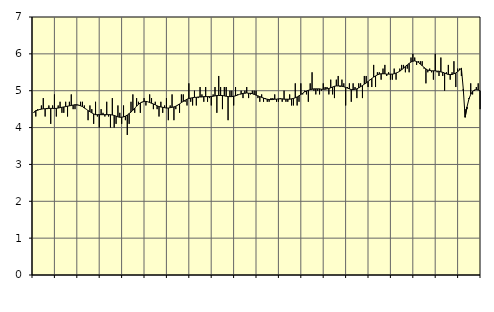
| Category | Piggar | Personliga och kulturella tjänster, SNI 90-98 |
|---|---|---|
| nan | 4.4 | 4.42 |
| 1.0 | 4.3 | 4.46 |
| 1.0 | 4.5 | 4.47 |
| 1.0 | 4.5 | 4.49 |
| 1.0 | 4.6 | 4.5 |
| 1.0 | 4.8 | 4.51 |
| 1.0 | 4.3 | 4.51 |
| 1.0 | 4.5 | 4.52 |
| 1.0 | 4.6 | 4.52 |
| 1.0 | 4.1 | 4.52 |
| 1.0 | 4.6 | 4.52 |
| 1.0 | 4.9 | 4.52 |
| nan | 4.3 | 4.52 |
| 2.0 | 4.6 | 4.53 |
| 2.0 | 4.7 | 4.54 |
| 2.0 | 4.4 | 4.55 |
| 2.0 | 4.4 | 4.56 |
| 2.0 | 4.7 | 4.57 |
| 2.0 | 4.3 | 4.58 |
| 2.0 | 4.7 | 4.59 |
| 2.0 | 4.9 | 4.6 |
| 2.0 | 4.5 | 4.61 |
| 2.0 | 4.5 | 4.62 |
| 2.0 | 4.6 | 4.62 |
| nan | 4.6 | 4.61 |
| 3.0 | 4.7 | 4.59 |
| 3.0 | 4.7 | 4.57 |
| 3.0 | 4.6 | 4.53 |
| 3.0 | 4.5 | 4.5 |
| 3.0 | 4.2 | 4.46 |
| 3.0 | 4.6 | 4.43 |
| 3.0 | 4.5 | 4.4 |
| 3.0 | 4.1 | 4.37 |
| 3.0 | 4.7 | 4.35 |
| 3.0 | 4.3 | 4.35 |
| 3.0 | 4 | 4.35 |
| nan | 4.5 | 4.35 |
| 4.0 | 4.4 | 4.35 |
| 4.0 | 4.3 | 4.35 |
| 4.0 | 4.7 | 4.35 |
| 4.0 | 4.3 | 4.35 |
| 4.0 | 4 | 4.35 |
| 4.0 | 4.8 | 4.34 |
| 4.0 | 4 | 4.33 |
| 4.0 | 4.1 | 4.31 |
| 4.0 | 4.6 | 4.29 |
| 4.0 | 4.4 | 4.28 |
| 4.0 | 4.1 | 4.28 |
| nan | 4.6 | 4.29 |
| 5.0 | 4.2 | 4.31 |
| 5.0 | 3.8 | 4.34 |
| 5.0 | 4.1 | 4.38 |
| 5.0 | 4.7 | 4.42 |
| 5.0 | 4.9 | 4.47 |
| 5.0 | 4.4 | 4.53 |
| 5.0 | 4.8 | 4.58 |
| 5.0 | 4.7 | 4.63 |
| 5.0 | 4.4 | 4.67 |
| 5.0 | 4.7 | 4.69 |
| 5.0 | 4.8 | 4.71 |
| nan | 4.6 | 4.71 |
| 6.0 | 4.7 | 4.7 |
| 6.0 | 4.9 | 4.68 |
| 6.0 | 4.8 | 4.66 |
| 6.0 | 4.5 | 4.64 |
| 6.0 | 4.7 | 4.62 |
| 6.0 | 4.5 | 4.59 |
| 6.0 | 4.3 | 4.57 |
| 6.0 | 4.7 | 4.56 |
| 6.0 | 4.4 | 4.55 |
| 6.0 | 4.6 | 4.54 |
| 6.0 | 4.8 | 4.53 |
| nan | 4.2 | 4.53 |
| 7.0 | 4.6 | 4.54 |
| 7.0 | 4.9 | 4.55 |
| 7.0 | 4.2 | 4.56 |
| 7.0 | 4.5 | 4.58 |
| 7.0 | 4.6 | 4.61 |
| 7.0 | 4.4 | 4.64 |
| 7.0 | 4.9 | 4.68 |
| 7.0 | 4.9 | 4.71 |
| 7.0 | 4.7 | 4.74 |
| 7.0 | 4.6 | 4.77 |
| 7.0 | 5.2 | 4.79 |
| nan | 4.7 | 4.8 |
| 8.0 | 4.6 | 4.81 |
| 8.0 | 5 | 4.82 |
| 8.0 | 4.6 | 4.82 |
| 8.0 | 4.8 | 4.83 |
| 8.0 | 5.1 | 4.83 |
| 8.0 | 4.9 | 4.83 |
| 8.0 | 4.7 | 4.84 |
| 8.0 | 5.1 | 4.84 |
| 8.0 | 4.7 | 4.84 |
| 8.0 | 4.8 | 4.84 |
| 8.0 | 4.6 | 4.84 |
| nan | 4.9 | 4.85 |
| 9.0 | 5.1 | 4.86 |
| 9.0 | 4.4 | 4.87 |
| 9.0 | 5.4 | 4.87 |
| 9.0 | 5.1 | 4.87 |
| 9.0 | 4.5 | 4.87 |
| 9.0 | 5.1 | 4.86 |
| 9.0 | 5.1 | 4.85 |
| 9.0 | 4.2 | 4.84 |
| 9.0 | 5 | 4.84 |
| 9.0 | 5 | 4.84 |
| 9.0 | 4.6 | 4.85 |
| nan | 5.1 | 4.86 |
| 10.0 | 4.9 | 4.88 |
| 10.0 | 4.9 | 4.9 |
| 10.0 | 5 | 4.91 |
| 10.0 | 4.8 | 4.93 |
| 10.0 | 5 | 4.93 |
| 10.0 | 5.1 | 4.94 |
| 10.0 | 4.8 | 4.93 |
| 10.0 | 4.9 | 4.93 |
| 10.0 | 5 | 4.92 |
| 10.0 | 5 | 4.9 |
| 10.0 | 5 | 4.88 |
| nan | 4.8 | 4.86 |
| 11.0 | 4.7 | 4.84 |
| 11.0 | 4.9 | 4.82 |
| 11.0 | 4.7 | 4.8 |
| 11.0 | 4.8 | 4.78 |
| 11.0 | 4.7 | 4.77 |
| 11.0 | 4.7 | 4.76 |
| 11.0 | 4.8 | 4.76 |
| 11.0 | 4.8 | 4.76 |
| 11.0 | 4.9 | 4.77 |
| 11.0 | 4.7 | 4.77 |
| 11.0 | 4.7 | 4.78 |
| nan | 4.8 | 4.78 |
| 12.0 | 4.7 | 4.78 |
| 12.0 | 5 | 4.77 |
| 12.0 | 4.7 | 4.77 |
| 12.0 | 4.7 | 4.77 |
| 12.0 | 4.9 | 4.77 |
| 12.0 | 4.6 | 4.78 |
| 12.0 | 4.6 | 4.79 |
| 12.0 | 5.2 | 4.81 |
| 12.0 | 4.6 | 4.83 |
| 12.0 | 4.7 | 4.86 |
| 12.0 | 5.2 | 4.9 |
| nan | 4.9 | 4.93 |
| 13.0 | 5 | 4.97 |
| 13.0 | 4.9 | 4.99 |
| 13.0 | 4.7 | 5.01 |
| 13.0 | 5.2 | 5.03 |
| 13.0 | 5.5 | 5.04 |
| 13.0 | 5 | 5.05 |
| 13.0 | 4.9 | 5.05 |
| 13.0 | 5 | 5.05 |
| 13.0 | 4.9 | 5.05 |
| 13.0 | 5 | 5.04 |
| 13.0 | 5.2 | 5.04 |
| nan | 5.1 | 5.04 |
| 14.0 | 5.1 | 5.05 |
| 14.0 | 4.9 | 5.06 |
| 14.0 | 5.3 | 5.08 |
| 14.0 | 4.9 | 5.1 |
| 14.0 | 4.8 | 5.12 |
| 14.0 | 5.3 | 5.13 |
| 14.0 | 5.4 | 5.13 |
| 14.0 | 5.1 | 5.13 |
| 14.0 | 5.3 | 5.12 |
| 14.0 | 5.2 | 5.11 |
| 14.0 | 4.6 | 5.09 |
| nan | 5.1 | 5.07 |
| 15.0 | 5.2 | 5.05 |
| 15.0 | 4.7 | 5.03 |
| 15.0 | 5.2 | 5.03 |
| 15.0 | 5.1 | 5.04 |
| 15.0 | 4.8 | 5.05 |
| 15.0 | 5.2 | 5.08 |
| 15.0 | 5.2 | 5.11 |
| 15.0 | 4.8 | 5.14 |
| 15.0 | 5.4 | 5.18 |
| 15.0 | 5.4 | 5.21 |
| 15.0 | 5.1 | 5.25 |
| nan | 5.3 | 5.29 |
| 16.0 | 5.1 | 5.33 |
| 16.0 | 5.7 | 5.37 |
| 16.0 | 5.1 | 5.4 |
| 16.0 | 5.5 | 5.43 |
| 16.0 | 5.5 | 5.45 |
| 16.0 | 5.3 | 5.46 |
| 16.0 | 5.6 | 5.46 |
| 16.0 | 5.7 | 5.46 |
| 16.0 | 5.4 | 5.45 |
| 16.0 | 5.5 | 5.45 |
| 16.0 | 5.3 | 5.45 |
| nan | 5.3 | 5.45 |
| 17.0 | 5.6 | 5.46 |
| 17.0 | 5.3 | 5.48 |
| 17.0 | 5.5 | 5.5 |
| 17.0 | 5.6 | 5.53 |
| 17.0 | 5.7 | 5.57 |
| 17.0 | 5.7 | 5.61 |
| 17.0 | 5.5 | 5.66 |
| 17.0 | 5.6 | 5.7 |
| 17.0 | 5.5 | 5.74 |
| 17.0 | 5.9 | 5.78 |
| 17.0 | 6 | 5.8 |
| nan | 5.9 | 5.81 |
| 18.0 | 5.7 | 5.79 |
| 18.0 | 5.8 | 5.77 |
| 18.0 | 5.8 | 5.72 |
| 18.0 | 5.8 | 5.68 |
| 18.0 | 5.6 | 5.63 |
| 18.0 | 5.2 | 5.59 |
| 18.0 | 5.5 | 5.56 |
| 18.0 | 5.6 | 5.55 |
| 18.0 | 5.5 | 5.54 |
| 18.0 | 5.3 | 5.54 |
| 18.0 | 6 | 5.54 |
| nan | 5.5 | 5.53 |
| 19.0 | 5.4 | 5.53 |
| 19.0 | 5.9 | 5.51 |
| 19.0 | 5.4 | 5.5 |
| 19.0 | 5 | 5.48 |
| 19.0 | 5.5 | 5.46 |
| 19.0 | 5.7 | 5.44 |
| 19.0 | 5.3 | 5.44 |
| 19.0 | 5.5 | 5.44 |
| 19.0 | 5.8 | 5.46 |
| 19.0 | 5.1 | 5.48 |
| 19.0 | 5.6 | 5.52 |
| nan | 5.6 | 5.56 |
| 20.0 | 5.4 | 5.61 |
| 20.0 | 5 | 5.05 |
| 20.0 | 4.5 | 4.28 |
| 20.0 | 4.5 | 4.56 |
| 20.0 | 4.8 | 4.77 |
| 20.0 | 5.2 | 4.9 |
| 20.0 | 4.9 | 4.98 |
| 20.0 | 5 | 5.02 |
| 20.0 | 5.1 | 5.03 |
| 20.0 | 5.2 | 5.02 |
| 20.0 | 4.5 | 5 |